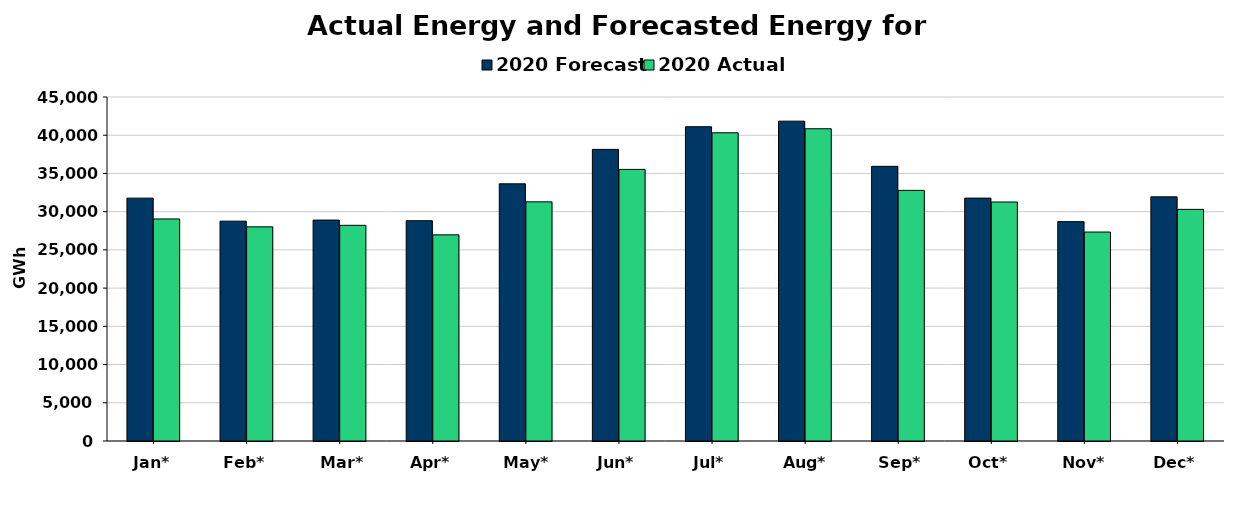
| Category | 2020 Forecast | 2020 Actual |
|---|---|---|
| Jan* | 31771 | 29045 |
| Feb* | 28757 | 28014 |
| Mar* | 28901 | 28214 |
| Apr* | 28816 | 26968 |
| May* | 33642 | 31283 |
| Jun* | 38147 | 35530 |
| Jul* | 41109 | 40318 |
| Aug* | 41838 | 40847 |
| Sep* | 35928 | 32785 |
| Oct* | 31773 | 31266 |
| Nov* | 28696 | 27335 |
| Dec* | 31943 | 30301 |